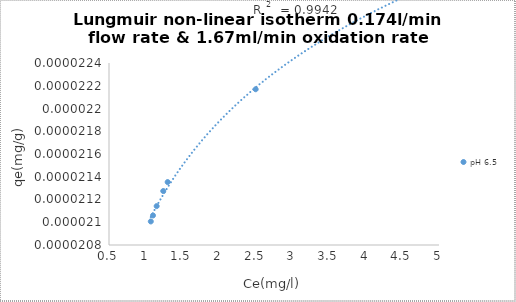
| Category | pH 6.5 |
|---|---|
| 2.5 | 0 |
| 1.24 | 0 |
| 1.07 | 0 |
| 1.1 | 0 |
| 1.15 | 0 |
| 1.3 | 0 |